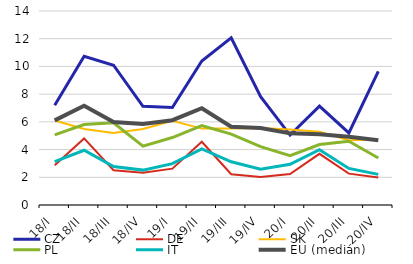
| Category | CZ | DE | SK | PL | IT | EU (medián) |
|---|---|---|---|---|---|---|
| 18/I | 7.2 | 2.862 | 6.099 | 5.066 | 3.125 | 6.106 |
| 18/II | 10.732 | 4.804 | 5.482 | 5.812 | 3.952 | 7.17 |
| 18/III | 10.089 | 2.508 | 5.202 | 5.927 | 2.779 | 5.986 |
| 18/IV | 7.123 | 2.331 | 5.48 | 4.25 | 2.518 | 5.85 |
| 19/I | 7.03 | 2.625 | 6.073 | 4.867 | 2.983 | 6.121 |
| 19/II | 10.391 | 4.562 | 5.514 | 5.725 | 4.052 | 6.983 |
| 19/III | 12.058 | 2.218 | 5.521 | 5.114 | 3.119 | 5.647 |
| 19/IV | 7.824 | 2.022 | 5.559 | 4.208 | 2.575 | 5.557 |
| 20/I | 5.044 | 2.231 | 5.445 | 3.559 | 2.934 | 5.169 |
| 20/II | 7.137 | 3.693 | 5.291 | 4.36 | 3.987 | 5.111 |
| 20/III | 5.199 | 2.263 | 4.668 | 4.604 | 2.639 | 4.932 |
| 20/IV | 9.646 | 1.981 | 4.725 | 3.397 | 2.209 | 4.667 |